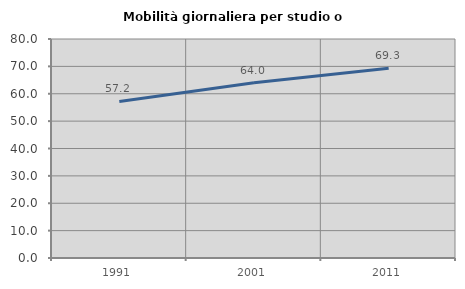
| Category | Mobilità giornaliera per studio o lavoro |
|---|---|
| 1991.0 | 57.193 |
| 2001.0 | 64.011 |
| 2011.0 | 69.322 |